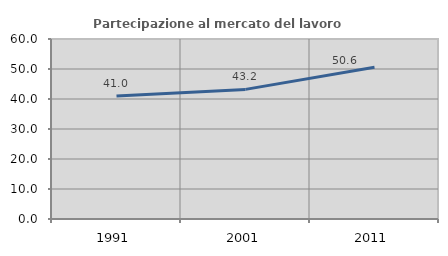
| Category | Partecipazione al mercato del lavoro  femminile |
|---|---|
| 1991.0 | 41.031 |
| 2001.0 | 43.208 |
| 2011.0 | 50.579 |